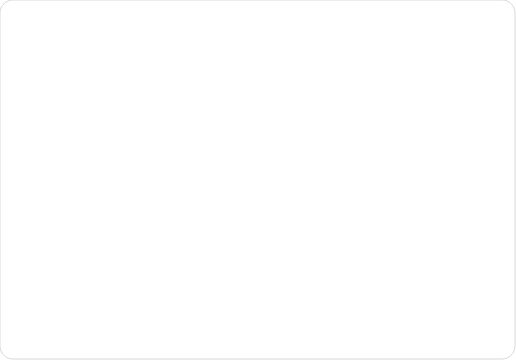
| Category | Series 0 |
|---|---|
| 0 | 19 |
| 1 | 10 |
| 2 | 3 |
| 3 | 1 |
| 4 | 1 |
| 5 | 1 |
| 6 | 5 |